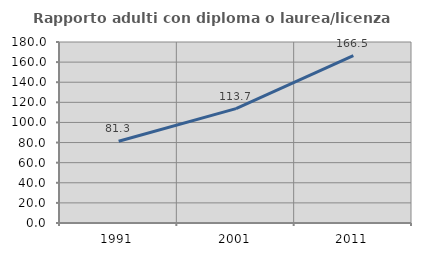
| Category | Rapporto adulti con diploma o laurea/licenza media  |
|---|---|
| 1991.0 | 81.319 |
| 2001.0 | 113.734 |
| 2011.0 | 166.528 |